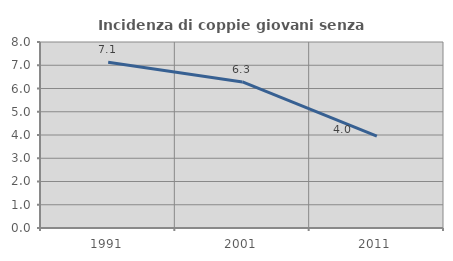
| Category | Incidenza di coppie giovani senza figli |
|---|---|
| 1991.0 | 7.127 |
| 2001.0 | 6.284 |
| 2011.0 | 3.955 |